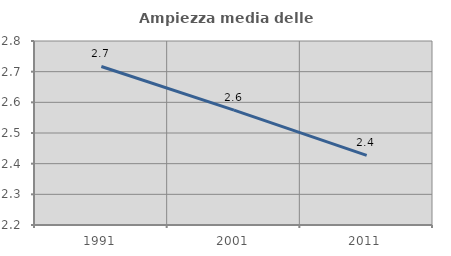
| Category | Ampiezza media delle famiglie |
|---|---|
| 1991.0 | 2.717 |
| 2001.0 | 2.575 |
| 2011.0 | 2.427 |